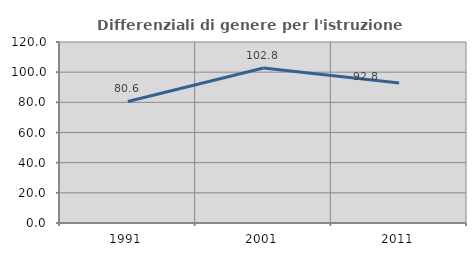
| Category | Differenziali di genere per l'istruzione superiore |
|---|---|
| 1991.0 | 80.572 |
| 2001.0 | 102.795 |
| 2011.0 | 92.758 |